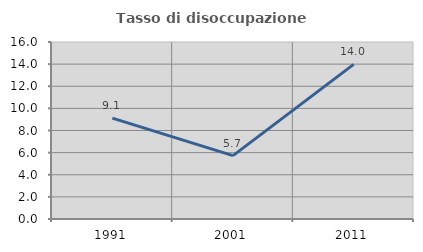
| Category | Tasso di disoccupazione giovanile  |
|---|---|
| 1991.0 | 9.116 |
| 2001.0 | 5.727 |
| 2011.0 | 13.975 |